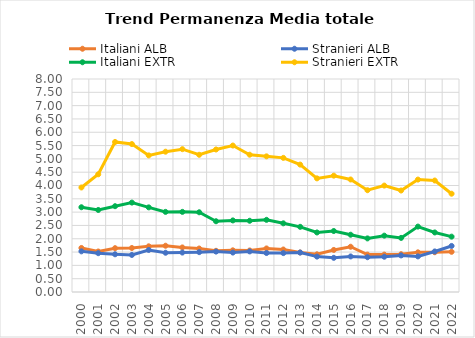
| Category | Italiani ALB | Stranieri ALB | Italiani EXTR | Stranieri EXTR |
|---|---|---|---|---|
| 2000.0 | 1.654 | 1.527 | 3.183 | 3.926 |
| 2001.0 | 1.521 | 1.458 | 3.081 | 4.421 |
| 2002.0 | 1.646 | 1.416 | 3.223 | 5.635 |
| 2003.0 | 1.652 | 1.392 | 3.358 | 5.557 |
| 2004.0 | 1.716 | 1.578 | 3.179 | 5.13 |
| 2005.0 | 1.738 | 1.474 | 3.009 | 5.27 |
| 2006.0 | 1.674 | 1.481 | 3.01 | 5.365 |
| 2007.0 | 1.633 | 1.497 | 2.994 | 5.154 |
| 2008.0 | 1.547 | 1.518 | 2.657 | 5.353 |
| 2009.0 | 1.565 | 1.482 | 2.688 | 5.501 |
| 2010.0 | 1.559 | 1.525 | 2.675 | 5.157 |
| 2011.0 | 1.636 | 1.464 | 2.71 | 5.095 |
| 2012.0 | 1.596 | 1.461 | 2.579 | 5.038 |
| 2013.0 | 1.485 | 1.482 | 2.448 | 4.785 |
| 2014.0 | 1.415 | 1.329 | 2.236 | 4.268 |
| 2015.0 | 1.58 | 1.283 | 2.29 | 4.369 |
| 2016.0 | 1.7 | 1.336 | 2.151 | 4.226 |
| 2017.0 | 1.404 | 1.306 | 2.013 | 3.823 |
| 2018.0 | 1.404 | 1.325 | 2.116 | 3.997 |
| 2019.0 | 1.42 | 1.374 | 2.032 | 3.811 |
| 2020.0 | 1.489 | 1.337 | 2.457 | 4.222 |
| 2021.0 | 1.494 | 1.523 | 2.236 | 4.187 |
| 2022.0 | 1.51 | 1.73 | 2.079 | 3.692 |